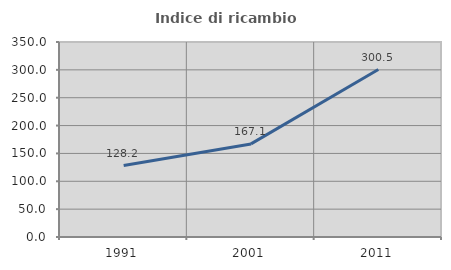
| Category | Indice di ricambio occupazionale  |
|---|---|
| 1991.0 | 128.228 |
| 2001.0 | 167.073 |
| 2011.0 | 300.541 |